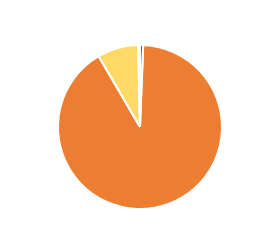
| Category | Series 0 |
|---|---|
| PC/MC | 228 |
| CAR/LGV | 33387 |
| OGV1 & PSV 2Axle | 2961 |
| OGV1 & PSV 3 Axle | 23 |
| OGV2 | 110 |